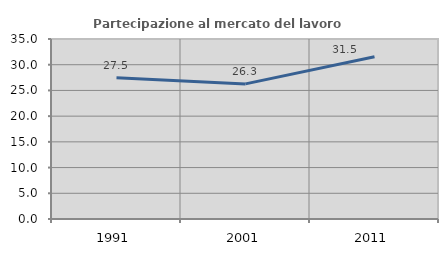
| Category | Partecipazione al mercato del lavoro  femminile |
|---|---|
| 1991.0 | 27.488 |
| 2001.0 | 26.27 |
| 2011.0 | 31.54 |